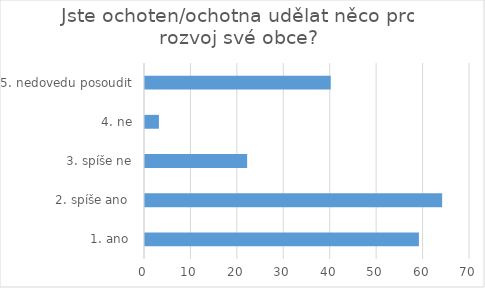
| Category | Series 0 |
|---|---|
| 1. ano  | 59 |
| 2. spíše ano  | 64 |
| 3. spíše ne | 22 |
| 4. ne | 3 |
| 5. nedovedu posoudit | 40 |